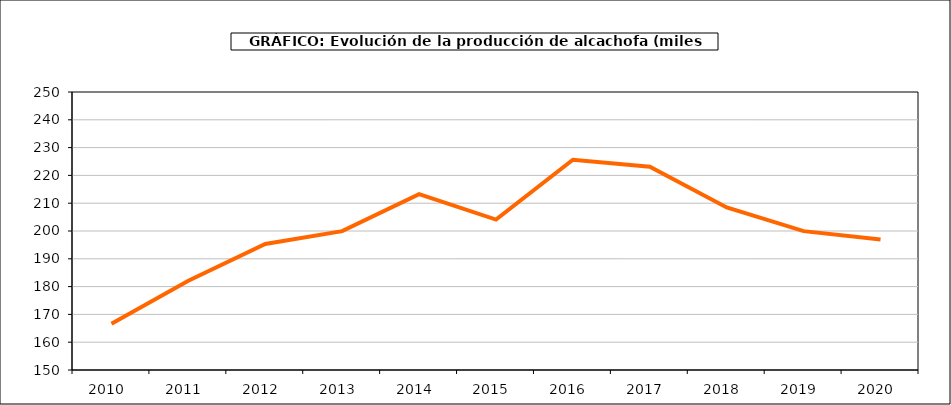
| Category | producción |
|---|---|
| 2010.0 | 166.662 |
| 2011.0 | 182.1 |
| 2012.0 | 195.342 |
| 2013.0 | 199.945 |
| 2014.0 | 213.258 |
| 2015.0 | 204.111 |
| 2016.0 | 225.616 |
| 2017.0 | 223.15 |
| 2018.0 | 208.463 |
| 2019.0 | 199.944 |
| 2020.0 | 196.965 |